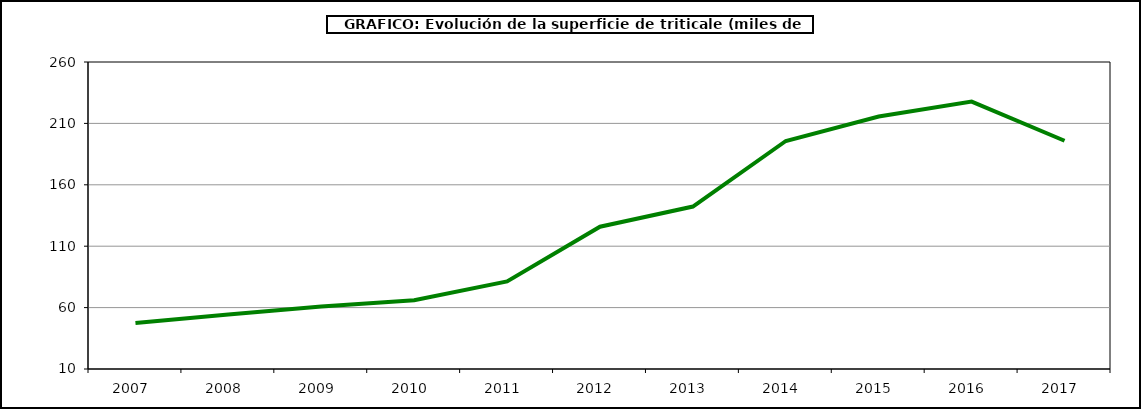
| Category | Superficie |
|---|---|
| 2007.0 | 47.411 |
| 2008.0 | 54.394 |
| 2009.0 | 60.987 |
| 2010.0 | 65.984 |
| 2011.0 | 81.322 |
| 2012.0 | 125.879 |
| 2013.0 | 142.31 |
| 2014.0 | 195.684 |
| 2015.0 | 215.62 |
| 2016.0 | 227.792 |
| 2017.0 | 195.884 |